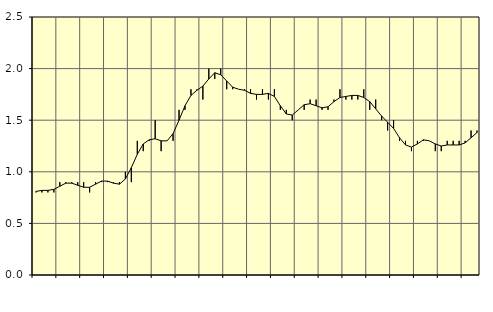
| Category | Piggar | Sysselsatta utomlands |
|---|---|---|
| nan | 0.8 | 0.81 |
| 1.0 | 0.8 | 0.82 |
| 1.0 | 0.8 | 0.82 |
| 1.0 | 0.8 | 0.83 |
| nan | 0.9 | 0.86 |
| 2.0 | 0.9 | 0.89 |
| 2.0 | 0.9 | 0.89 |
| 2.0 | 0.9 | 0.87 |
| nan | 0.9 | 0.85 |
| 3.0 | 0.8 | 0.85 |
| 3.0 | 0.9 | 0.88 |
| 3.0 | 0.9 | 0.91 |
| nan | 0.9 | 0.91 |
| 4.0 | 0.9 | 0.89 |
| 4.0 | 0.9 | 0.88 |
| 4.0 | 1 | 0.93 |
| nan | 0.9 | 1.04 |
| 5.0 | 1.3 | 1.17 |
| 5.0 | 1.2 | 1.27 |
| 5.0 | 1.3 | 1.31 |
| nan | 1.5 | 1.32 |
| 6.0 | 1.2 | 1.3 |
| 6.0 | 1.3 | 1.3 |
| 6.0 | 1.3 | 1.37 |
| nan | 1.6 | 1.5 |
| 7.0 | 1.6 | 1.64 |
| 7.0 | 1.8 | 1.74 |
| 7.0 | 1.8 | 1.79 |
| nan | 1.7 | 1.83 |
| 8.0 | 2 | 1.9 |
| 8.0 | 1.9 | 1.96 |
| 8.0 | 2 | 1.94 |
| nan | 1.8 | 1.88 |
| 9.0 | 1.8 | 1.82 |
| 9.0 | 1.8 | 1.8 |
| 9.0 | 1.8 | 1.79 |
| nan | 1.8 | 1.76 |
| 10.0 | 1.7 | 1.75 |
| 10.0 | 1.8 | 1.75 |
| 10.0 | 1.7 | 1.76 |
| nan | 1.8 | 1.73 |
| 11.0 | 1.6 | 1.64 |
| 11.0 | 1.6 | 1.56 |
| 11.0 | 1.5 | 1.55 |
| nan | 1.6 | 1.6 |
| 12.0 | 1.6 | 1.65 |
| 12.0 | 1.7 | 1.66 |
| 12.0 | 1.7 | 1.64 |
| nan | 1.6 | 1.62 |
| 13.0 | 1.6 | 1.63 |
| 13.0 | 1.7 | 1.68 |
| 13.0 | 1.8 | 1.72 |
| nan | 1.7 | 1.73 |
| 14.0 | 1.7 | 1.74 |
| 14.0 | 1.7 | 1.74 |
| 14.0 | 1.8 | 1.72 |
| nan | 1.6 | 1.68 |
| 15.0 | 1.7 | 1.61 |
| 15.0 | 1.5 | 1.54 |
| 15.0 | 1.4 | 1.48 |
| nan | 1.5 | 1.42 |
| 16.0 | 1.3 | 1.33 |
| 16.0 | 1.3 | 1.26 |
| 16.0 | 1.2 | 1.24 |
| nan | 1.3 | 1.27 |
| 17.0 | 1.3 | 1.31 |
| 17.0 | 1.3 | 1.3 |
| 17.0 | 1.2 | 1.27 |
| nan | 1.2 | 1.25 |
| 18.0 | 1.3 | 1.26 |
| 18.0 | 1.3 | 1.26 |
| 18.0 | 1.3 | 1.26 |
| nan | 1.3 | 1.28 |
| 19.0 | 1.4 | 1.33 |
| 19.0 | 1.4 | 1.38 |